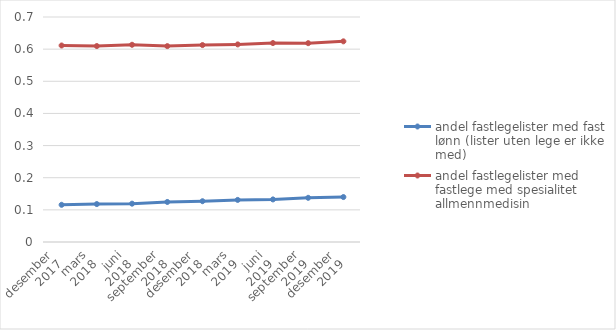
| Category | andel fastlegelister med fast lønn (lister uten lege er ikke med) | andel fastlegelister med fastlege med spesialitet allmennmedisin |
|---|---|---|
| 0 | 0.116 | 0.611 |
| 1 | 0.118 | 0.61 |
| 2 | 0.119 | 0.614 |
| 3 | 0.125 | 0.609 |
| 4 | 0.127 | 0.613 |
| 5 | 0.131 | 0.615 |
| 6 | 0.132 | 0.619 |
| 7 | 0.137 | 0.619 |
| 8 | 0.14 | 0.624 |